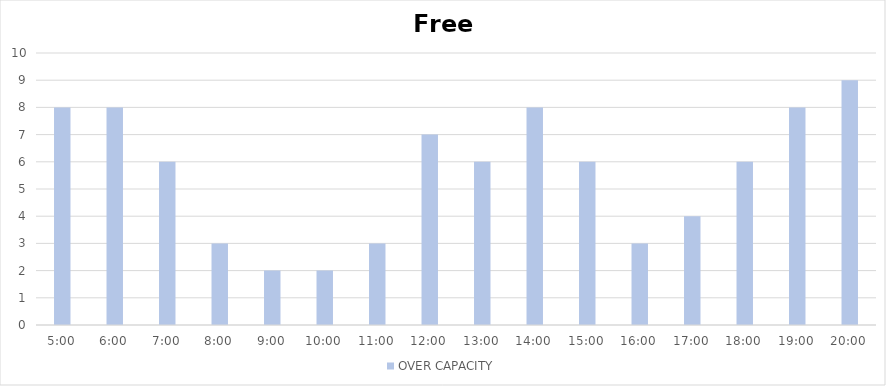
| Category | OVER CAPACITY |
|---|---|
| 0.20833333333333334 | 8 |
| 0.25 | 8 |
| 0.2916666666666667 | 6 |
| 0.3333333333333333 | 3 |
| 0.375 | 2 |
| 0.4166666666666667 | 2 |
| 0.4583333333333333 | 3 |
| 0.5 | 7 |
| 0.5416666666666666 | 6 |
| 0.5833333333333334 | 8 |
| 0.625 | 6 |
| 0.6666666666666666 | 3 |
| 0.7083333333333334 | 4 |
| 0.75 | 6 |
| 0.7916666666666666 | 8 |
| 0.8333333333333334 | 9 |